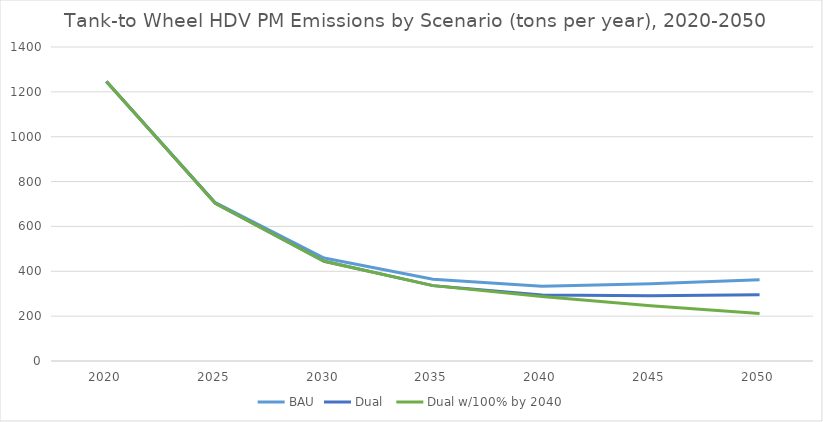
| Category | BAU | Dual  | Dual w/100% by 2040 |
|---|---|---|---|
| 2020.0 | 1246.703 | 1246.703 | 1246.703 |
| 2025.0 | 705.829 | 703.414 | 703.414 |
| 2030.0 | 459.329 | 444.387 | 444.387 |
| 2035.0 | 364.438 | 336.021 | 336.021 |
| 2040.0 | 332.791 | 294.641 | 287.127 |
| 2045.0 | 344.663 | 290.942 | 246.113 |
| 2050.0 | 362.083 | 295.402 | 211.424 |